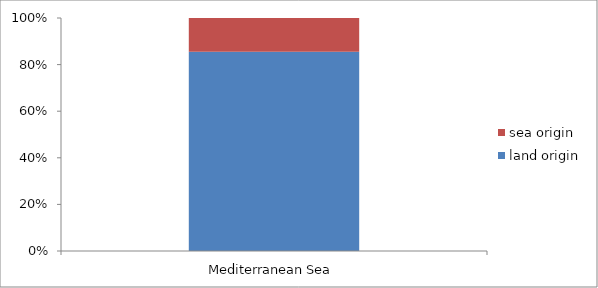
| Category | land origin | sea origin |
|---|---|---|
| Mediterranean Sea | 102481.5 | 17294 |